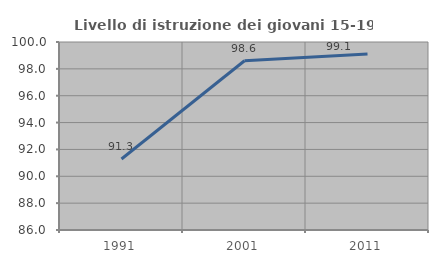
| Category | Livello di istruzione dei giovani 15-19 anni |
|---|---|
| 1991.0 | 91.286 |
| 2001.0 | 98.601 |
| 2011.0 | 99.115 |